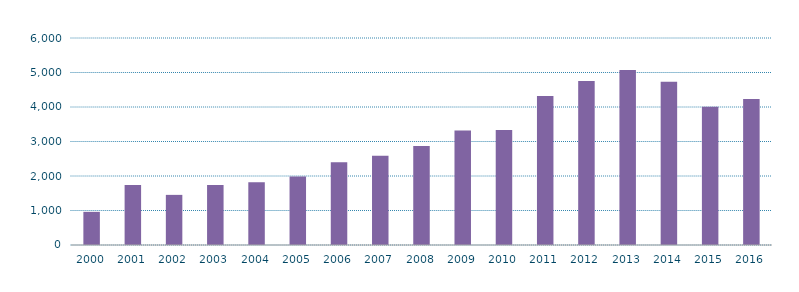
| Category | Nacional |
|---|---|
| 2000.0 | 961.11 |
| 2001.0 | 1738.458 |
| 2002.0 | 1453.015 |
| 2003.0 | 1737.042 |
| 2004.0 | 1818.094 |
| 2005.0 | 1987.858 |
| 2006.0 | 2400.806 |
| 2007.0 | 2588.968 |
| 2008.0 | 2868.708 |
| 2009.0 | 3317.342 |
| 2010.0 | 3332.36 |
| 2011.0 | 4317.989 |
| 2012.0 | 4754.768 |
| 2013.0 | 5074.696 |
| 2014.0 | 4729.8 |
| 2015.0 | 4010.583 |
| 2016.0 | 4229.932 |